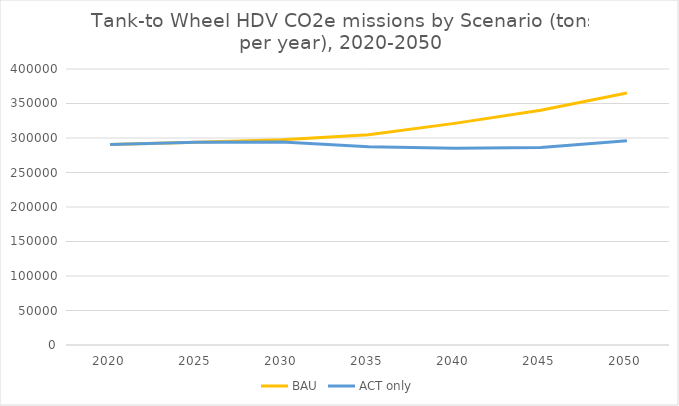
| Category | BAU | ACT only |
|---|---|---|
| 2020.0 | 290439.981 | 290439.981 |
| 2025.0 | 293944.963 | 293944.963 |
| 2030.0 | 297319.719 | 294288.148 |
| 2035.0 | 304626.098 | 287223.244 |
| 2040.0 | 321213.189 | 285018.058 |
| 2045.0 | 340195.781 | 286398.614 |
| 2050.0 | 365246.602 | 295840.948 |